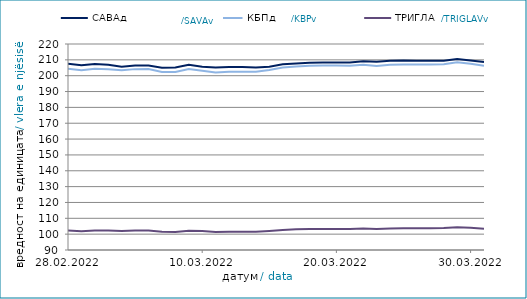
| Category | САВАд | КБПд | ТРИГЛАВд |
|---|---|---|---|
| 2022-02-28 | 207.467 | 204.311 | 102.358 |
| 2022-03-01 | 206.534 | 203.368 | 101.895 |
| 2022-03-02 | 207.412 | 204.366 | 102.351 |
| 2022-03-03 | 206.962 | 204.117 | 102.323 |
| 2022-03-04 | 205.721 | 203.394 | 101.973 |
| 2022-03-05 | 206.379 | 204.143 | 102.327 |
| 2022-03-06 | 206.384 | 204.149 | 102.329 |
| 2022-03-07 | 205.032 | 202.355 | 101.468 |
| 2022-03-08 | 205.164 | 202.368 | 101.399 |
| 2022-03-09 | 206.956 | 204.213 | 102.195 |
| 2022-03-10 | 205.701 | 203.168 | 101.913 |
| 2022-03-11 | 205.099 | 202.034 | 101.344 |
| 2022-03-12 | 205.499 | 202.506 | 101.563 |
| 2022-03-13 | 205.504 | 202.513 | 101.565 |
| 2022-03-14 | 205.112 | 202.418 | 101.509 |
| 2022-03-15 | 205.717 | 203.547 | 102.038 |
| 2022-03-16 | 207.156 | 205.184 | 102.673 |
| 2022-03-17 | 207.754 | 205.774 | 103.049 |
| 2022-03-18 | 208.151 | 206.208 | 103.222 |
| 2022-03-19 | 208.36 | 206.444 | 103.329 |
| 2022-03-20 | 208.365 | 206.451 | 103.331 |
| 2022-03-21 | 208.276 | 206.23 | 103.322 |
| 2022-03-22 | 209.172 | 206.93 | 103.545 |
| 2022-03-23 | 208.729 | 206.181 | 103.259 |
| 2022-03-24 | 209.406 | 206.937 | 103.625 |
| 2022-03-25 | 209.528 | 207.138 | 103.779 |
| 2022-03-26 | 209.43 | 207.015 | 103.721 |
| 2022-03-27 | 209.435 | 207.022 | 103.723 |
| 2022-03-28 | 209.466 | 207.272 | 103.834 |
| 2022-03-29 | 210.53 | 208.464 | 104.353 |
| 2022-03-30 | 209.585 | 207.467 | 103.964 |
| 2022-03-31 | 208.585 | 206.319 | 103.405 |